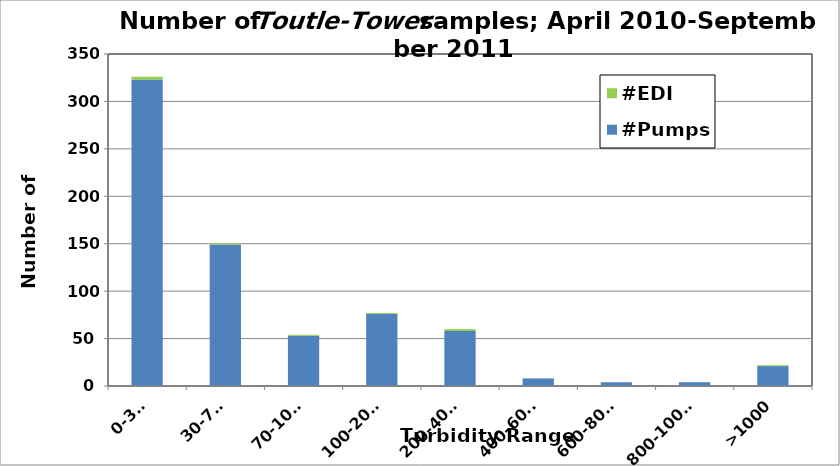
| Category | #Pumps | #EDI |
|---|---|---|
| 0-30, | 323 | 3 |
| 30-70, | 149 | 1 |
| 70-100, | 53 | 1 |
| 100-200, | 76 | 1 |
| 200-400, | 58 | 2 |
| 400-600, | 8 | 0 |
| 600-800, | 4 | 0 |
| 800-1000, | 4 | 0 |
| >1000 | 21 | 1 |